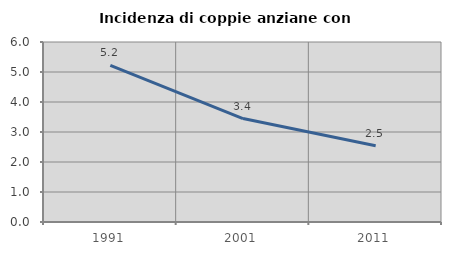
| Category | Incidenza di coppie anziane con figli |
|---|---|
| 1991.0 | 5.217 |
| 2001.0 | 3.448 |
| 2011.0 | 2.542 |